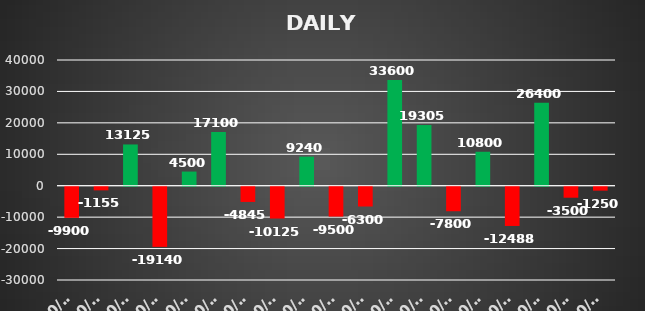
| Category | Series 0 |
|---|---|
| 2022-10-03 | -9900 |
| 2022-10-04 | -1155 |
| 2022-10-04 | 13125 |
| 2022-10-06 | -19140 |
| 2022-10-07 | 4500 |
| 2022-10-10 | 17100 |
| 2022-10-11 | -4845 |
| 2022-10-12 | -10125 |
| 2022-10-13 | 9240 |
| 2022-10-14 | -9500 |
| 2022-10-17 | -6300 |
| 2022-10-18 | 33600 |
| 2022-10-19 | 19305 |
| 2022-10-20 | -7800 |
| 2022-10-25 | 10800 |
| 2022-10-27 | -12487.5 |
| 2022-10-28 | 26400 |
| 2022-10-31 | -3500 |
| 2022-10-31 | -1250 |